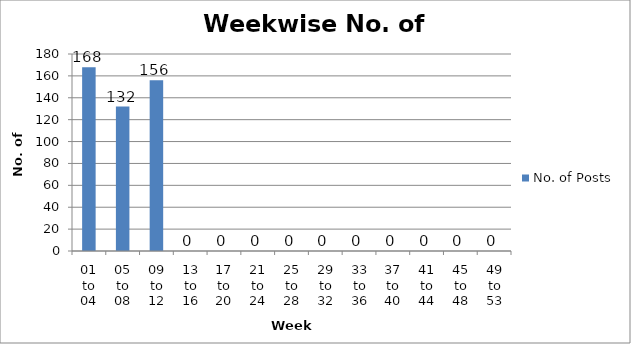
| Category | No. of Posts |
|---|---|
| 01 to 04 | 168 |
| 05 to 08 | 132 |
| 09 to 12 | 156 |
| 13 to 16 | 0 |
| 17 to 20 | 0 |
| 21 to 24 | 0 |
| 25 to 28 | 0 |
| 29 to 32 | 0 |
| 33 to 36 | 0 |
| 37 to 40 | 0 |
| 41 to 44 | 0 |
| 45 to 48 | 0 |
| 49 to 53 | 0 |